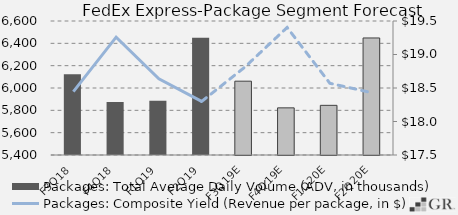
| Category | Packages: Total Average Daily Volume (ADV, in thousands) |
|---|---|
|  F3Q18  | 6122.1 |
|  F4Q18  | 5874.2 |
|  F1Q19  | 5886.7 |
|  F2Q19  | 6449.5 |
|  F3Q19E  | 6061.034 |
|  F4Q19E  | 5822.163 |
|  F1Q20E  | 5844.788 |
|  F2Q20E  | 6448.075 |